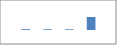
| Category | Data5 |
|---|---|
| 0 | 23 |
| 1 | 19 |
| 2 | 19 |
| 3 | 347 |